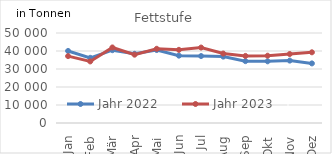
| Category | Jahr 2022 | Jahr 2023 |
|---|---|---|
| 0 | 40027.896 | 37156.523 |
| 1 | 36208.104 | 34206.356 |
| 2 | 40452.789 | 41969.501 |
| 3 | 38447.75 | 37960.816 |
| 4 | 40535.566 | 41224.483 |
| 5 | 37419.305 | 40638.91 |
| 6 | 37200.552 | 41915.313 |
| 7 | 36877.994 | 38588.449 |
| 8 | 34372.859 | 37271.561 |
| 9 | 34269.857 | 37395.502 |
| 10 | 34670.666 | 38320.76 |
| 11 | 33108.261 | 39278.523 |